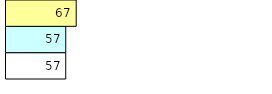
| Category | Total Standouts | Total Recd | Total Tipsters |
|---|---|---|---|
| 0 | 57 | 57 | 67 |